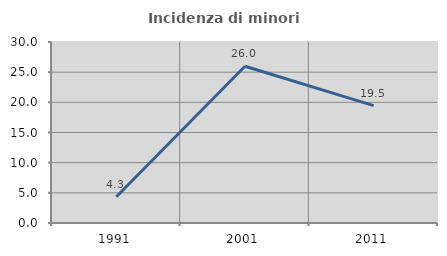
| Category | Incidenza di minori stranieri |
|---|---|
| 1991.0 | 4.348 |
| 2001.0 | 25.974 |
| 2011.0 | 19.459 |